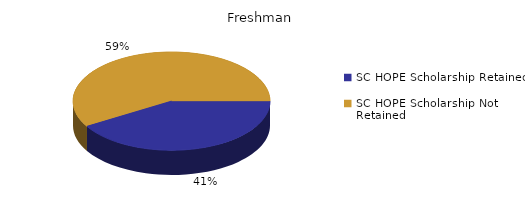
| Category | Freshman |
|---|---|
| SC HOPE Scholarship Retained  | 41 |
| SC HOPE Scholarship Not Retained  | 58 |